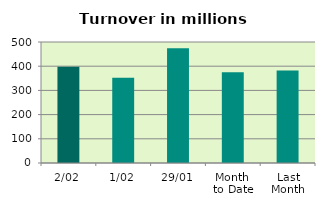
| Category | Series 0 |
|---|---|
| 2/02 | 397.879 |
| 1/02 | 351.999 |
| 29/01 | 474.02 |
| Month 
to Date | 374.939 |
| Last
Month | 381.872 |